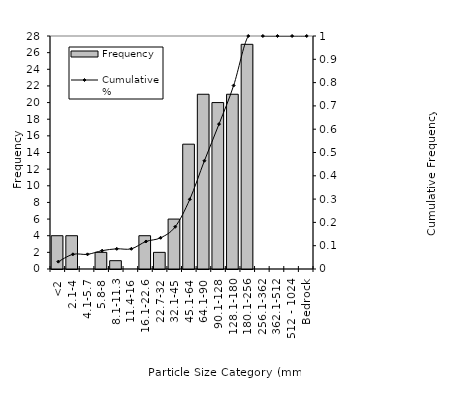
| Category | Frequency |
|---|---|
| <2 | 4 |
| 2.1-4 | 4 |
| 4.1-5.7 | 0 |
| 5.8-8 | 2 |
| 8.1-11.3 | 1 |
| 11.4-16 | 0 |
| 16.1-22.6 | 4 |
| 22.7-32 | 2 |
| 32.1-45 | 6 |
| 45.1-64 | 15 |
| 64.1-90 | 21 |
| 90.1-128 | 20 |
| 128.1-180 | 21 |
| 180.1-256 | 27 |
| 256.1-362 | 0 |
| 362.1-512 | 0 |
| 512 - 1024 | 0 |
| Bedrock | 0 |